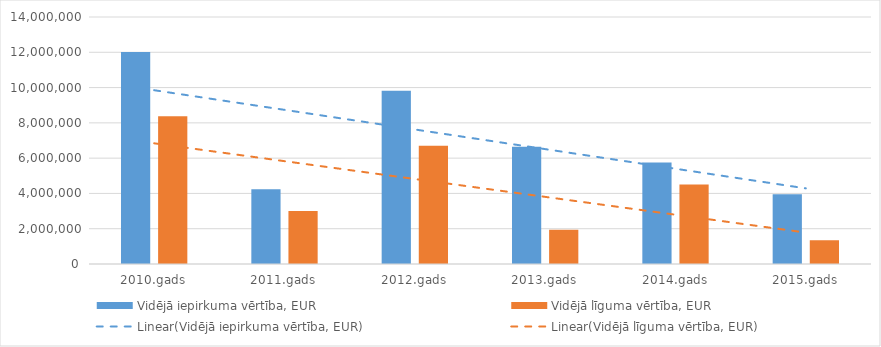
| Category | Vidējā iepirkuma vērtība, EUR | Vidējā līguma vērtība, EUR |
|---|---|---|
| 2010.gads | 12014192 | 8376192 |
| 2011.gads | 4236994 | 3003839 |
| 2012.gads | 9814321 | 6697611 |
| 2013.gads | 6642750 | 1940382 |
| 2014.gads | 5749010 | 4500869 |
| 2015.gads | 3952429 | 1346432 |